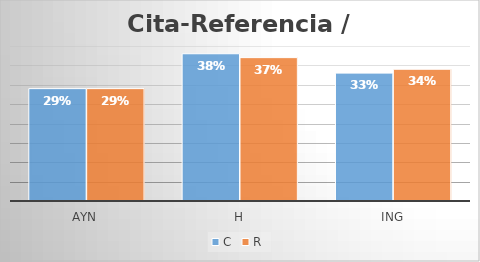
| Category | C | R |
|---|---|---|
| AyN | 0.29 | 0.29 |
| H | 0.38 | 0.37 |
| Ing | 0.33 | 0.34 |